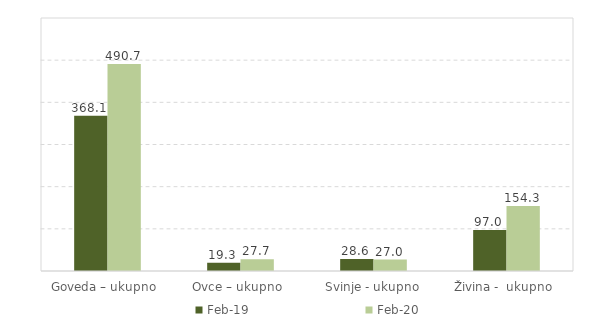
| Category | Feb-19 | Feb-20 |
|---|---|---|
| Goveda – ukupno  | 368.1 | 490.7 |
| Ovce – ukupno  | 19.3 | 27.7 |
| Svinje - ukupno | 28.6 | 27 |
| Živina -  ukupno  | 97 | 154.3 |